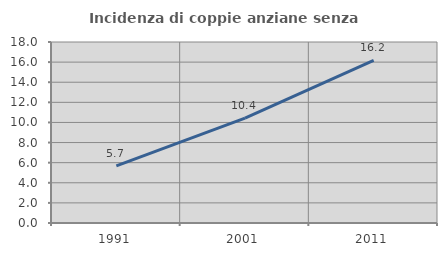
| Category | Incidenza di coppie anziane senza figli  |
|---|---|
| 1991.0 | 5.689 |
| 2001.0 | 10.429 |
| 2011.0 | 16.162 |